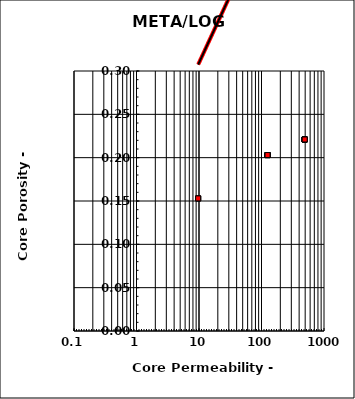
| Category | Series 0 |
|---|---|
| 9.7 | 0.153 |
| 9.7 | 0.153 |
| 9.7 | 0.153 |
| 125.0 | 0.203 |
| 125.0 | 0.203 |
| 125.0 | 0.203 |
| 125.0 | 0.203 |
| 125.0 | 0.203 |
| 125.0 | 0.203 |
| 125.0 | 0.203 |
| 491.0 | 0.221 |
| 491.0 | 0.221 |
| 491.0 | 0.221 |
| 491.0 | 0.221 |
| 491.0 | 0.221 |
| 491.0 | 0.221 |
| 491.0 | 0.221 |
| 491.0 | 0.221 |